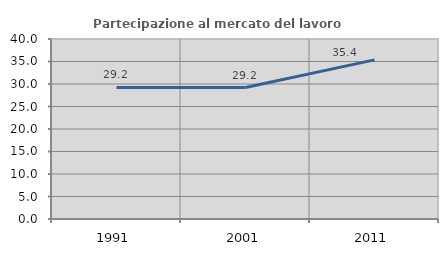
| Category | Partecipazione al mercato del lavoro  femminile |
|---|---|
| 1991.0 | 29.226 |
| 2001.0 | 29.204 |
| 2011.0 | 35.361 |